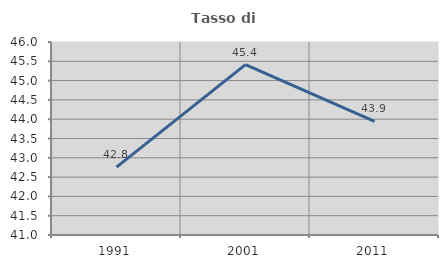
| Category | Tasso di occupazione   |
|---|---|
| 1991.0 | 42.759 |
| 2001.0 | 45.414 |
| 2011.0 | 43.942 |